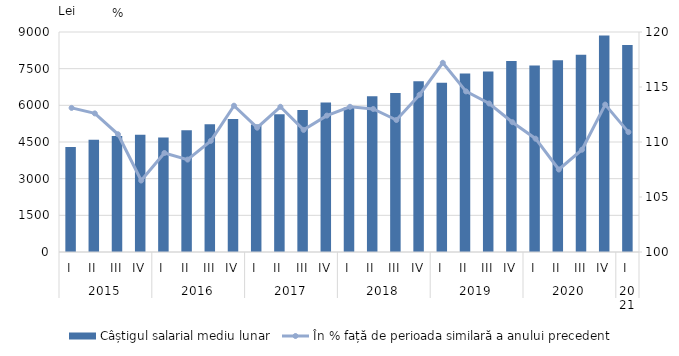
| Category | Câștigul salarial mediu lunar |
|---|---|
| 0 | 4300.2 |
| 1 | 4594.2 |
| 2 | 4749.2 |
| 3 | 4800.8 |
| 4 | 4689.2 |
| 5 | 4980.7 |
| 6 | 5229.2 |
| 7 | 5437.4 |
| 8 | 5218.9 |
| 9 | 5636.7 |
| 10 | 5809.1 |
| 11 | 6113.6 |
| 12 | 5906.5 |
| 13 | 6369.8 |
| 14 | 6507.3 |
| 15 | 6987.5 |
| 16 | 6923 |
| 17 | 7302.6 |
| 18 | 7385 |
| 19 | 7813.1 |
| 20 | 7633.9 |
| 21 | 7849 |
| 22 | 8074.3 |
| 23 | 8859.9 |
| 24 | 8468.6 |